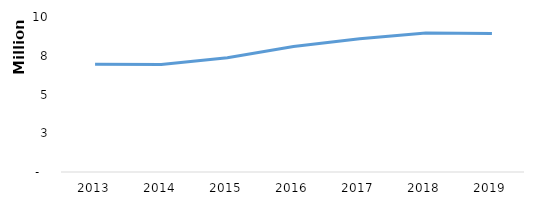
| Category | All NI Airports |
|---|---|
| 2013.0 | 6949164 |
| 2014.0 | 6937077 |
| 2015.0 | 7367094 |
| 2016.0 | 8103209 |
| 2017.0 | 8590562 |
| 2018.0 | 8966064 |
| 2019.0 | 8937599 |